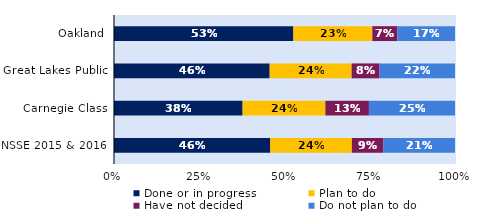
| Category | Done or in progress | Plan to do | Have not decided | Do not plan to do |
|---|---|---|---|---|
| Oakland | 0.526 | 0.232 | 0.073 | 0.169 |
| Great Lakes Public | 0.457 | 0.24 | 0.082 | 0.221 |
| Carnegie Class | 0.377 | 0.243 | 0.128 | 0.252 |
| NSSE 2015 & 2016 | 0.458 | 0.239 | 0.093 | 0.21 |